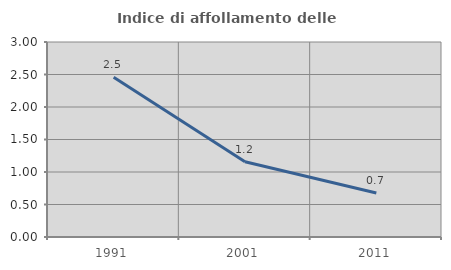
| Category | Indice di affollamento delle abitazioni  |
|---|---|
| 1991.0 | 2.456 |
| 2001.0 | 1.159 |
| 2011.0 | 0.678 |